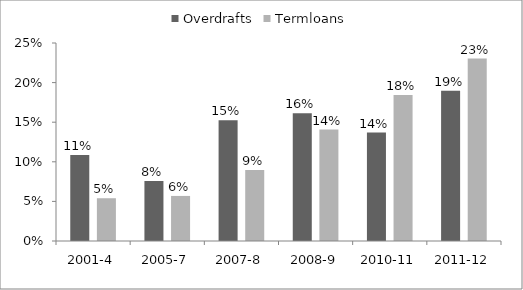
| Category | Overdrafts | Termloans |
|---|---|---|
| 2001-4 | 0.108 | 0.054 |
| 2005-7 | 0.076 | 0.057 |
| 2007-8 | 0.153 | 0.09 |
| 2008-9 | 0.161 | 0.141 |
| 2010-11 | 0.137 | 0.184 |
| 2011-12 | 0.19 | 0.23 |